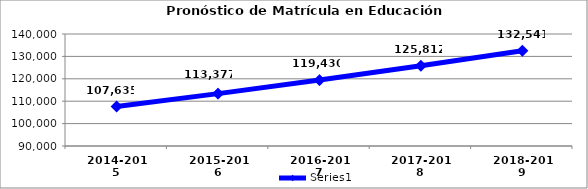
| Category | Series 0 |
|---|---|
| 2014-2015 | 107634.875 |
| 2015-2016 | 113376.881 |
| 2016-2017 | 119430.246 |
| 2017-2018 | 125812.104 |
| 2018-2019 | 132540.545 |